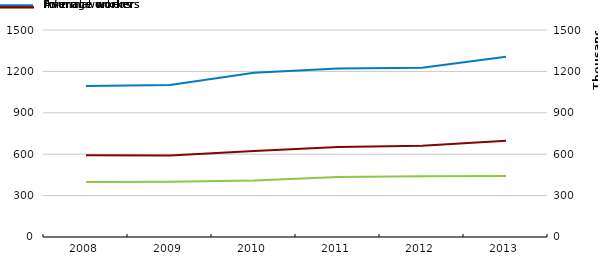
| Category | Formal workers | Informal workers |
|---|---|---|
| 2008.0 | 1093612.005 | 399264.802 |
| 2009.0 | 1101192.833 | 400082.094 |
| 2010.0 | 1189662.365 | 409639.88 |
| 2011.0 | 1220284.719 | 434390.742 |
| 2012.0 | 1225610.125 | 440881.169 |
| 2013.0 | 1306009.219 | 442725.117 |